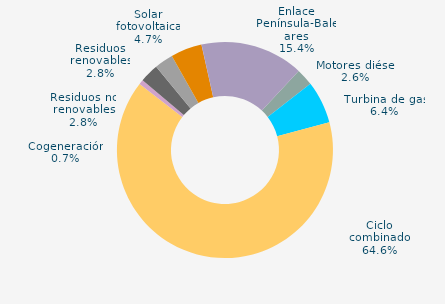
| Category | Series 0 |
|---|---|
| Carbón | 0 |
| Motores diésel | 2.558 |
| Turbina de gas | 6.369 |
| Ciclo combinado | 64.616 |
| Generación auxiliar | 0 |
| Cogeneración | 0.704 |
| Residuos no renovables | 2.808 |
| Residuos renovables | 2.808 |
| Eólica | 0.007 |
| Solar fotovoltaica | 4.678 |
| Otras renovables | 0.023 |
| Enlace Península-Baleares | 15.429 |